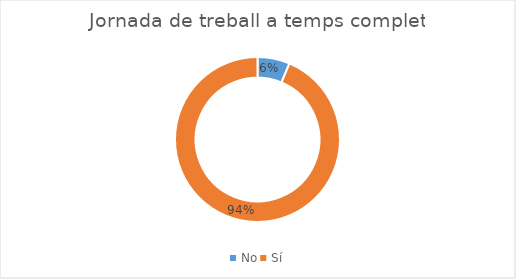
| Category | Series 0 |
|---|---|
| No | 5 |
| Sí | 74 |